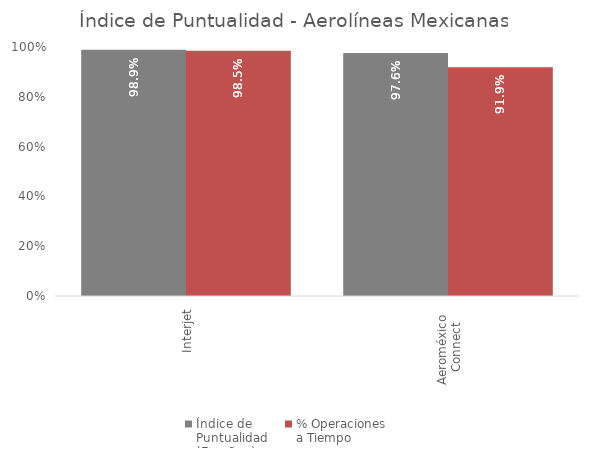
| Category | Índice de 
Puntualidad
(Ene-Sep) | % Operaciones 
a Tiempo |
|---|---|---|
| Interjet | 0.989 | 0.985 |
| Aeroméxico 
Connect | 0.976 | 0.919 |